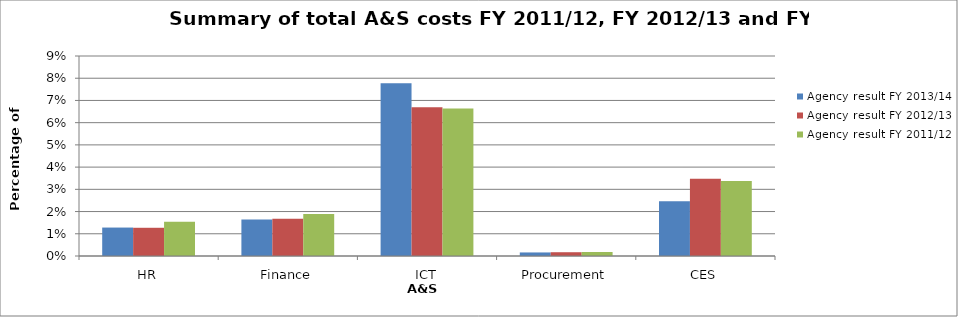
| Category | Agency result FY 2013/14 | Agency result FY 2012/13 | Agency result FY 2011/12 |
|---|---|---|---|
| HR | 0.013 | 0.013 | 0.015 |
| Finance | 0.016 | 0.017 | 0.019 |
| ICT | 0.078 | 0.067 | 0.066 |
| Procurement | 0.002 | 0.002 | 0.002 |
| CES | 0.025 | 0.035 | 0.034 |